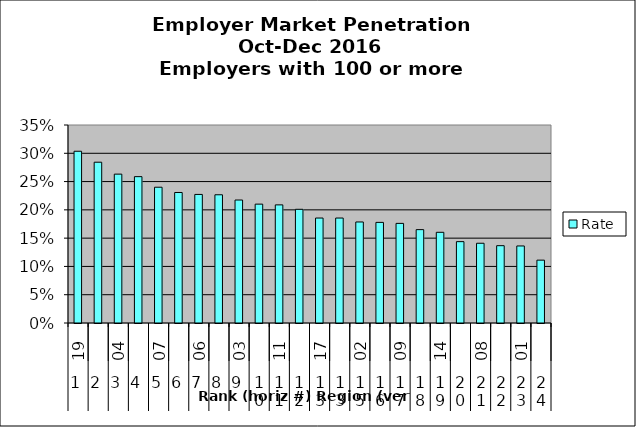
| Category | Rate |
|---|---|
| 0 | 0.304 |
| 1 | 0.284 |
| 2 | 0.263 |
| 3 | 0.259 |
| 4 | 0.24 |
| 5 | 0.231 |
| 6 | 0.227 |
| 7 | 0.227 |
| 8 | 0.217 |
| 9 | 0.21 |
| 10 | 0.209 |
| 11 | 0.201 |
| 12 | 0.186 |
| 13 | 0.186 |
| 14 | 0.179 |
| 15 | 0.178 |
| 16 | 0.176 |
| 17 | 0.165 |
| 18 | 0.16 |
| 19 | 0.144 |
| 20 | 0.141 |
| 21 | 0.137 |
| 22 | 0.136 |
| 23 | 0.111 |